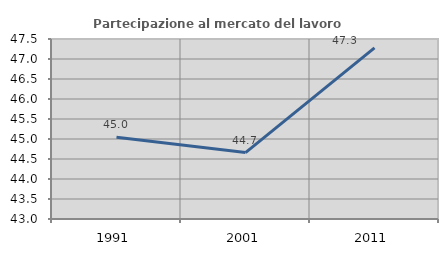
| Category | Partecipazione al mercato del lavoro  femminile |
|---|---|
| 1991.0 | 45.045 |
| 2001.0 | 44.661 |
| 2011.0 | 47.277 |